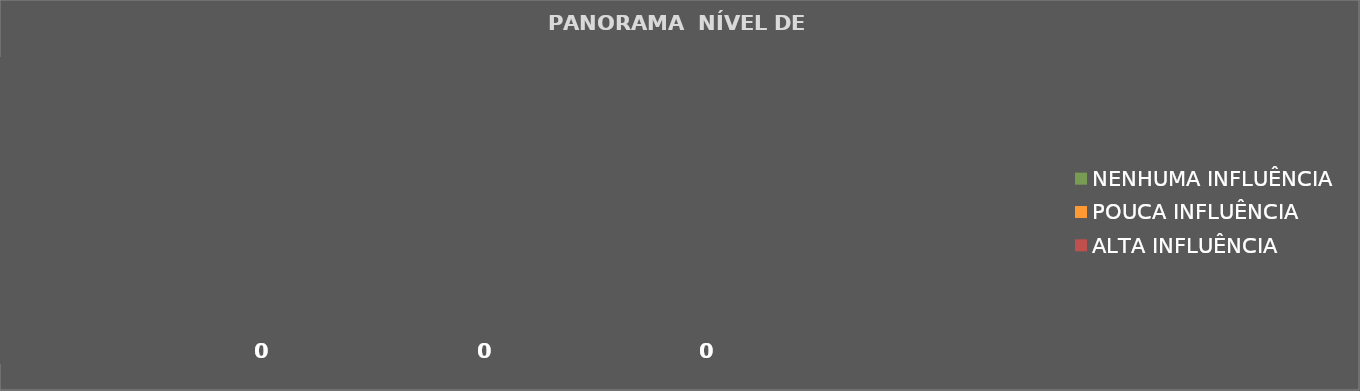
| Category | NENHUMA INFLUÊNCIA | POUCA INFLUÊNCIA | ALTA INFLUÊNCIA |
|---|---|---|---|
| 0 | 0 | 0 | 0 |